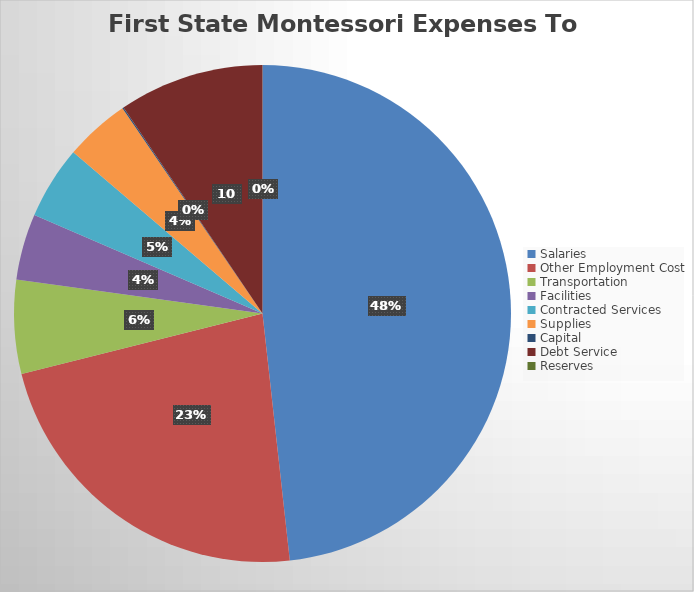
| Category | Series 0 |
|---|---|
| Salaries | 3903581.39 |
| Other Employment Cost | 1847676.08 |
| Transportation | 494063.21 |
| Facilities | 347314.09 |
| Contracted Services | 383822.24 |
| Supplies | 343264.03 |
| Capital | 6645.6 |
| Debt Service | 764340.32 |
| Reserves | 0 |